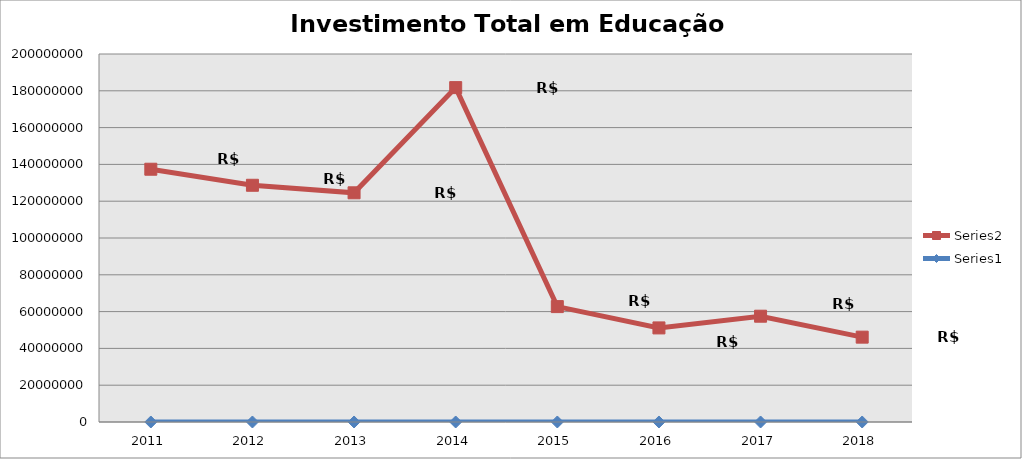
| Category | Series 0 | Series 1 |
|---|---|---|
| 2011.0 | 2011 | 137373662.46 |
| 2012.0 | 2012 | 128657089.9 |
| 2013.0 | 2013 | 124556451.14 |
| 2014.0 | 2014 | 181725362.47 |
| 2015.0 | 2015 | 62712484.02 |
| 2016.0 | 2016 | 51134238.75 |
| 2017.0 | 2017 | 57490511.57 |
| 2018.0 | 2018 | 46112690.77 |